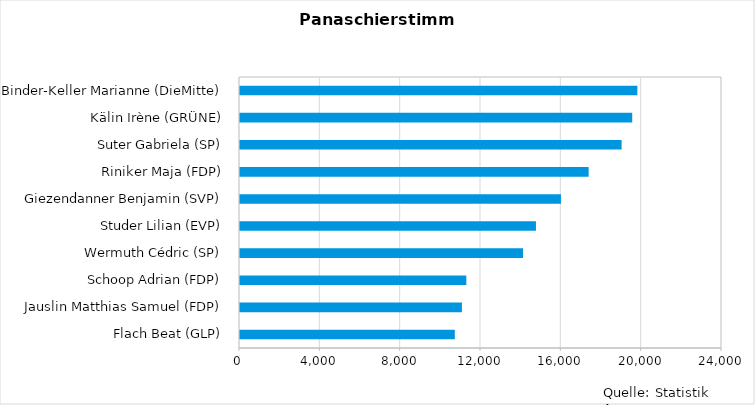
| Category | Series 0 |
|---|---|
| Binder-Keller Marianne (DieMitte) | 19786 |
| Kälin Irène (GRÜNE) | 19530 |
| Suter Gabriela (SP) | 19001 |
| Riniker Maja (FDP) | 17360 |
| Giezendanner Benjamin (SVP) | 15981 |
| Studer Lilian (EVP) | 14737 |
| Wermuth Cédric (SP) | 14093 |
| Schoop Adrian (FDP) | 11269 |
| Jauslin Matthias Samuel (FDP) | 11050 |
| Flach Beat (GLP) | 10696 |